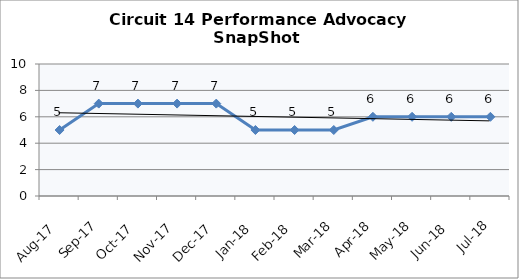
| Category | Circuit 14 |
|---|---|
| Aug-17 | 5 |
| Sep-17 | 7 |
| Oct-17 | 7 |
| Nov-17 | 7 |
| Dec-17 | 7 |
| Jan-18 | 5 |
| Feb-18 | 5 |
| Mar-18 | 5 |
| Apr-18 | 6 |
| May-18 | 6 |
| Jun-18 | 6 |
| Jul-18 | 6 |